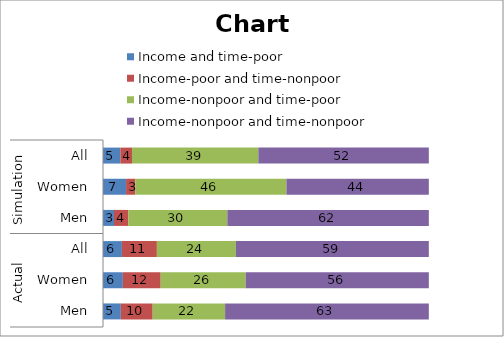
| Category | Income and time-poor | Income-poor and time-nonpoor | Income-nonpoor and time-poor | Income-nonpoor and time-nonpoor |
|---|---|---|---|---|
| 0 | 5.47 | 9.783 | 22.22 | 62.527 |
| 1 | 6.094 | 11.607 | 26.089 | 56.209 |
| 2 | 5.798 | 10.741 | 24.252 | 59.209 |
| 3 | 3.37 | 4.399 | 30.391 | 61.84 |
| 4 | 7.085 | 2.823 | 46.378 | 43.714 |
| 5 | 5.321 | 3.571 | 38.788 | 52.32 |